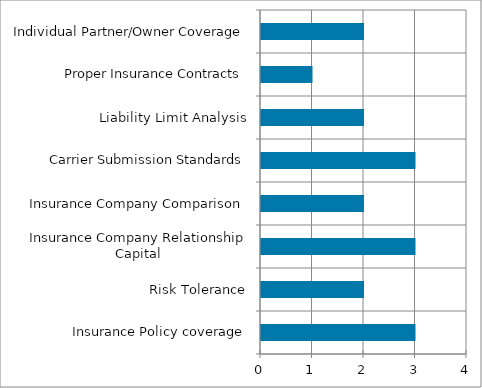
| Category | Series 0 |
|---|---|
| Insurance Policy coverage | 3 |
| Risk Tolerance | 2 |
| Insurance Company Relationship Capital | 3 |
| Insurance Company Comparison | 2 |
| Carrier Submission Standards | 3 |
| Liability Limit Analysis | 2 |
| Proper Insurance Contracts | 1 |
| Individual Partner/Owner Coverage | 2 |